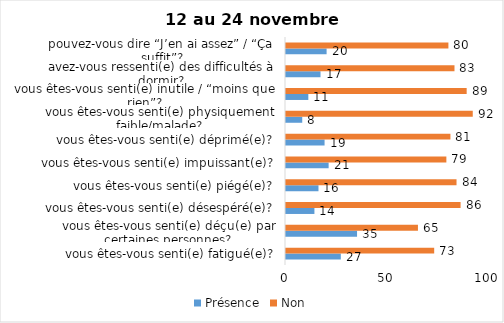
| Category | Présence | Non |
|---|---|---|
| vous êtes-vous senti(e) fatigué(e)? | 27 | 73 |
| vous êtes-vous senti(e) déçu(e) par certaines personnes? | 35 | 65 |
| vous êtes-vous senti(e) désespéré(e)? | 14 | 86 |
| vous êtes-vous senti(e) piégé(e)? | 16 | 84 |
| vous êtes-vous senti(e) impuissant(e)? | 21 | 79 |
| vous êtes-vous senti(e) déprimé(e)? | 19 | 81 |
| vous êtes-vous senti(e) physiquement faible/malade? | 8 | 92 |
| vous êtes-vous senti(e) inutile / “moins que rien”? | 11 | 89 |
| avez-vous ressenti(e) des difficultés à dormir? | 17 | 83 |
| pouvez-vous dire “J’en ai assez” / “Ça suffit”? | 20 | 80 |